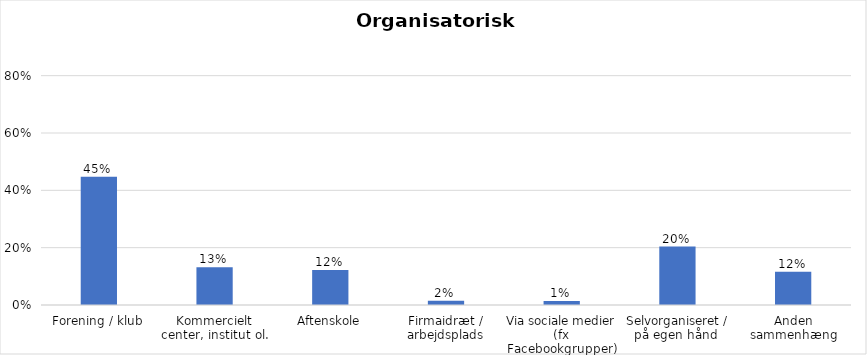
| Category | % |
|---|---|
| Forening / klub | 0.448 |
| Kommercielt center, institut ol. | 0.132 |
| Aftenskole | 0.122 |
| Firmaidræt / arbejdsplads | 0.015 |
| Via sociale medier (fx Facebookgrupper) | 0.014 |
| Selvorganiseret / på egen hånd  | 0.204 |
| Anden sammenhæng | 0.116 |